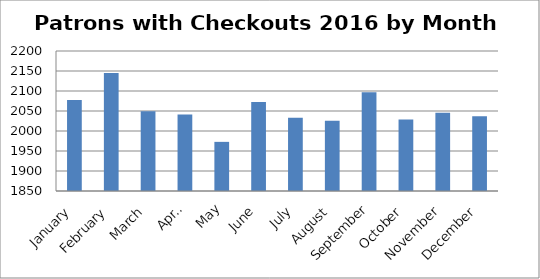
| Category | 2078 |
|---|---|
| January | 2077.806 |
| February | 2145.207 |
| March | 2049.677 |
| April | 2041.333 |
| May | 1972.839 |
| June | 2072.8 |
| July | 2033.032 |
| August | 2025.516 |
| September | 2097 |
| October | 2029.032 |
| November | 2045.9 |
| December | 2037.129 |